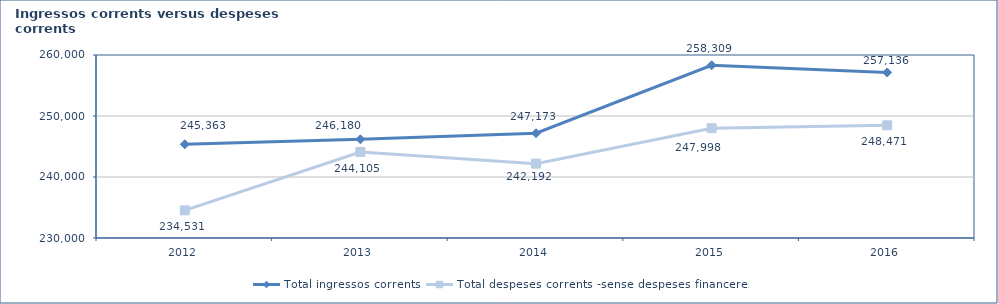
| Category | Total ingressos corrents  | Total despeses corrents -sense despeses financeres- |
|---|---|---|
| 2012.0 | 245362.51 | 234530.634 |
| 2013.0 | 246180.024 | 244105.345 |
| 2014.0 | 247172.559 | 242192.442 |
| 2015.0 | 258309.141 | 247998.24 |
| 2016.0 | 257135.521 | 248471.272 |